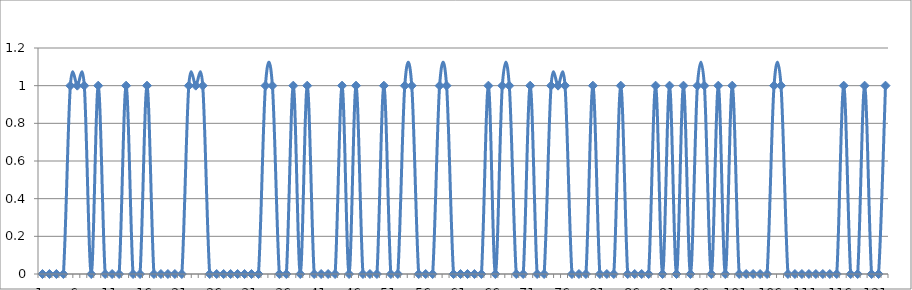
| Category | Series 0 |
|---|---|
| 0 | 0 |
| 1 | 0 |
| 2 | 0 |
| 3 | 0 |
| 4 | 1 |
| 5 | 1 |
| 6 | 1 |
| 7 | 0 |
| 8 | 1 |
| 9 | 0 |
| 10 | 0 |
| 11 | 0 |
| 12 | 1 |
| 13 | 0 |
| 14 | 0 |
| 15 | 1 |
| 16 | 0 |
| 17 | 0 |
| 18 | 0 |
| 19 | 0 |
| 20 | 0 |
| 21 | 1 |
| 22 | 1 |
| 23 | 1 |
| 24 | 0 |
| 25 | 0 |
| 26 | 0 |
| 27 | 0 |
| 28 | 0 |
| 29 | 0 |
| 30 | 0 |
| 31 | 0 |
| 32 | 1 |
| 33 | 1 |
| 34 | 0 |
| 35 | 0 |
| 36 | 1 |
| 37 | 0 |
| 38 | 1 |
| 39 | 0 |
| 40 | 0 |
| 41 | 0 |
| 42 | 0 |
| 43 | 1 |
| 44 | 0 |
| 45 | 1 |
| 46 | 0 |
| 47 | 0 |
| 48 | 0 |
| 49 | 1 |
| 50 | 0 |
| 51 | 0 |
| 52 | 1 |
| 53 | 1 |
| 54 | 0 |
| 55 | 0 |
| 56 | 0 |
| 57 | 1 |
| 58 | 1 |
| 59 | 0 |
| 60 | 0 |
| 61 | 0 |
| 62 | 0 |
| 63 | 0 |
| 64 | 1 |
| 65 | 0 |
| 66 | 1 |
| 67 | 1 |
| 68 | 0 |
| 69 | 0 |
| 70 | 1 |
| 71 | 0 |
| 72 | 0 |
| 73 | 1 |
| 74 | 1 |
| 75 | 1 |
| 76 | 0 |
| 77 | 0 |
| 78 | 0 |
| 79 | 1 |
| 80 | 0 |
| 81 | 0 |
| 82 | 0 |
| 83 | 1 |
| 84 | 0 |
| 85 | 0 |
| 86 | 0 |
| 87 | 0 |
| 88 | 1 |
| 89 | 0 |
| 90 | 1 |
| 91 | 0 |
| 92 | 1 |
| 93 | 0 |
| 94 | 1 |
| 95 | 1 |
| 96 | 0 |
| 97 | 1 |
| 98 | 0 |
| 99 | 1 |
| 100 | 0 |
| 101 | 0 |
| 102 | 0 |
| 103 | 0 |
| 104 | 0 |
| 105 | 1 |
| 106 | 1 |
| 107 | 0 |
| 108 | 0 |
| 109 | 0 |
| 110 | 0 |
| 111 | 0 |
| 112 | 0 |
| 113 | 0 |
| 114 | 0 |
| 115 | 1 |
| 116 | 0 |
| 117 | 0 |
| 118 | 1 |
| 119 | 0 |
| 120 | 0 |
| 121 | 1 |